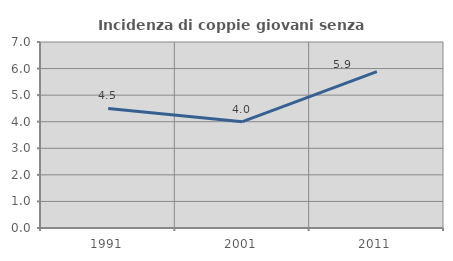
| Category | Incidenza di coppie giovani senza figli |
|---|---|
| 1991.0 | 4.5 |
| 2001.0 | 4 |
| 2011.0 | 5.882 |